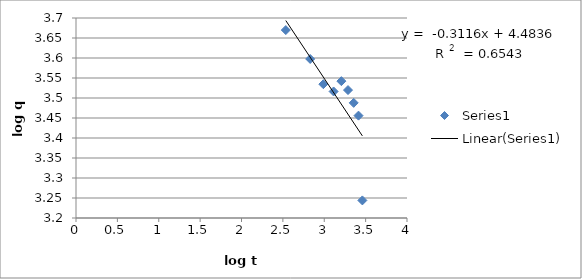
| Category | Series 0 |
|---|---|
| 2.5353131363027126 | 3.67 |
| 2.8301897481409957 | 3.598 |
| 2.9888975458969265 | 3.535 |
| 3.113124601983255 | 3.516 |
| 3.2070951322586496 | 3.542 |
| 3.2871256092505443 | 3.52 |
| 3.3559065920012934 | 3.488 |
| 3.4140710838147266 | 3.456 |
| 3.4605900816128723 | 3.244 |